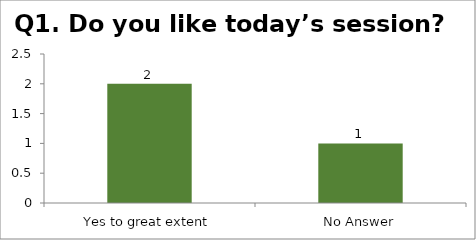
| Category | Q1. Do you like today’s session? |
|---|---|
| Yes to great extent | 2 |
| No Answer | 1 |